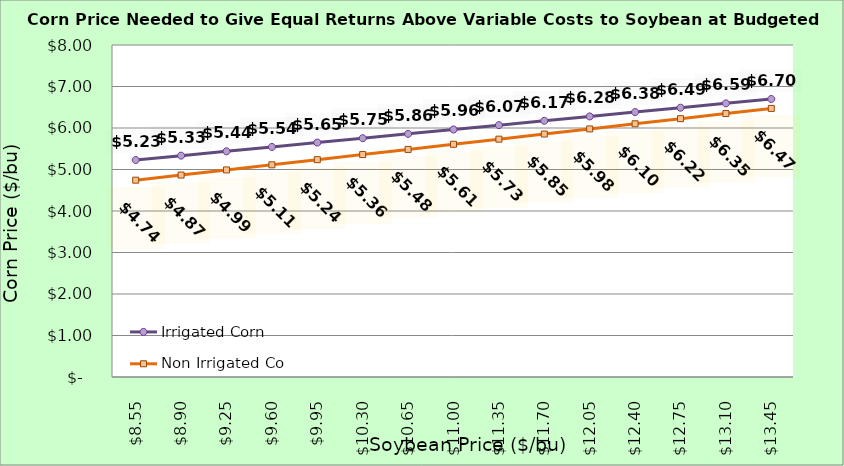
| Category | Irrigated Corn | Non Irrigated Corn |
|---|---|---|
| 8.550000000000002 | 5.229 | 4.743 |
| 8.900000000000002 | 5.334 | 4.866 |
| 9.250000000000002 | 5.439 | 4.99 |
| 9.600000000000001 | 5.544 | 5.113 |
| 9.950000000000001 | 5.649 | 5.237 |
| 10.3 | 5.754 | 5.36 |
| 10.65 | 5.859 | 5.484 |
| 11.0 | 5.964 | 5.607 |
| 11.35 | 6.069 | 5.731 |
| 11.7 | 6.174 | 5.854 |
| 12.049999999999999 | 6.279 | 5.978 |
| 12.399999999999999 | 6.384 | 6.101 |
| 12.749999999999998 | 6.489 | 6.225 |
| 13.099999999999998 | 6.594 | 6.348 |
| 13.449999999999998 | 6.699 | 6.472 |